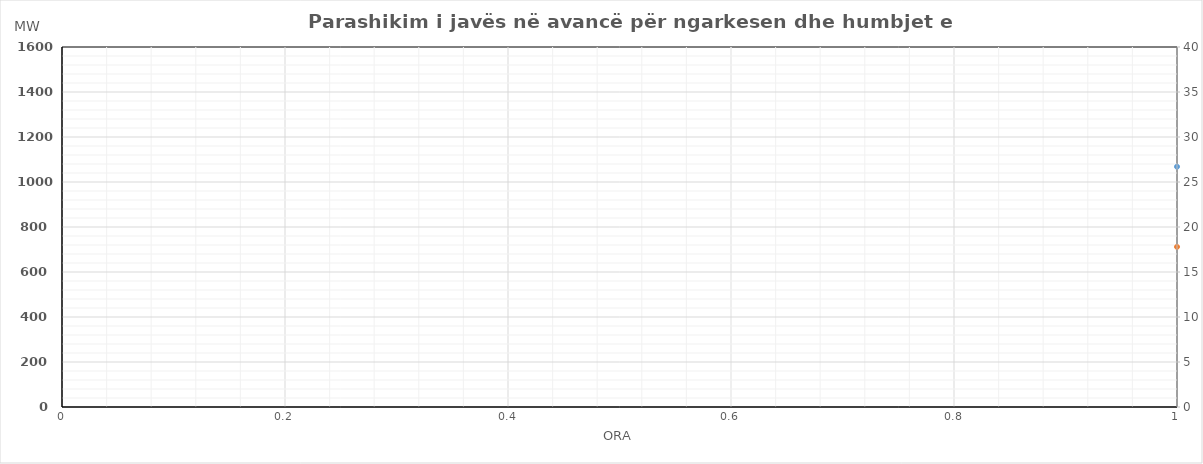
| Category | Ngarkesa (MWh) |
|---|---|
| 0 | 711.647 |
| 1 | 613.781 |
| 2 | 565.813 |
| 3 | 544.857 |
| 4 | 553.183 |
| 5 | 610.039 |
| 6 | 721.594 |
| 7 | 914.611 |
| 8 | 1063.562 |
| 9 | 1097.433 |
| 10 | 1072.949 |
| 11 | 1039.997 |
| 12 | 1034.129 |
| 13 | 1038.083 |
| 14 | 1034.867 |
| 15 | 1055.49 |
| 16 | 1142.966 |
| 17 | 1227.331 |
| 18 | 1224.467 |
| 19 | 1205.721 |
| 20 | 1165.87 |
| 21 | 1079.936 |
| 22 | 956.059 |
| 23 | 812.971 |
| 24 | 688.683 |
| 25 | 595.846 |
| 26 | 548.36 |
| 27 | 532.952 |
| 28 | 542.149 |
| 29 | 593.256 |
| 30 | 711.178 |
| 31 | 895.248 |
| 32 | 1051.552 |
| 33 | 1082.606 |
| 34 | 1047.328 |
| 35 | 1018.969 |
| 36 | 999.77 |
| 37 | 1002.435 |
| 38 | 1000.434 |
| 39 | 1027.436 |
| 40 | 1112.126 |
| 41 | 1214.141 |
| 42 | 1215.835 |
| 43 | 1204.718 |
| 44 | 1175.874 |
| 45 | 1093.389 |
| 46 | 956.792 |
| 47 | 802.391 |
| 48 | 662.209 |
| 49 | 578.369 |
| 50 | 541.719 |
| 51 | 528.528 |
| 52 | 539.391 |
| 53 | 597.205 |
| 54 | 736.454 |
| 55 | 945.028 |
| 56 | 1098.146 |
| 57 | 1129.258 |
| 58 | 1098.046 |
| 59 | 1075.029 |
| 60 | 1056.374 |
| 61 | 1061.212 |
| 62 | 1059.638 |
| 63 | 1072.526 |
| 64 | 1143.661 |
| 65 | 1244.459 |
| 66 | 1246.051 |
| 67 | 1232.528 |
| 68 | 1202.997 |
| 69 | 1115.603 |
| 70 | 970.593 |
| 71 | 820.252 |
| 72 | 677.515 |
| 73 | 587.584 |
| 74 | 564.581 |
| 75 | 577.625 |
| 76 | 600.636 |
| 77 | 602.118 |
| 78 | 748.11 |
| 79 | 979.157 |
| 80 | 1093.704 |
| 81 | 1136.701 |
| 82 | 1112.116 |
| 83 | 1097.788 |
| 84 | 1087.725 |
| 85 | 1090.627 |
| 86 | 1105.341 |
| 87 | 1107.034 |
| 88 | 1151.097 |
| 89 | 1253.878 |
| 90 | 1261.014 |
| 91 | 1240.899 |
| 92 | 1221.73 |
| 93 | 1130.661 |
| 94 | 987.096 |
| 95 | 830.471 |
| 96 | 680.381 |
| 97 | 596.766 |
| 98 | 554.712 |
| 99 | 542.548 |
| 100 | 552.847 |
| 101 | 610.561 |
| 102 | 747.347 |
| 103 | 963.656 |
| 104 | 1097.093 |
| 105 | 1122.187 |
| 106 | 1088.995 |
| 107 | 1066.463 |
| 108 | 1047.183 |
| 109 | 1049.792 |
| 110 | 1066.978 |
| 111 | 1080.406 |
| 112 | 1151.752 |
| 113 | 1242.822 |
| 114 | 1246.496 |
| 115 | 1236.878 |
| 116 | 1205.527 |
| 117 | 1124.126 |
| 118 | 977.201 |
| 119 | 814.824 |
| 120 | 718.107 |
| 121 | 624.396 |
| 122 | 576.082 |
| 123 | 558.806 |
| 124 | 569.661 |
| 125 | 623.585 |
| 126 | 755.458 |
| 127 | 976.662 |
| 128 | 1145.444 |
| 129 | 1174.988 |
| 130 | 1140.956 |
| 131 | 1113.51 |
| 132 | 1117.699 |
| 133 | 1121.925 |
| 134 | 1143.495 |
| 135 | 1173.403 |
| 136 | 1256.884 |
| 137 | 1368.392 |
| 138 | 1355.715 |
| 139 | 1307.761 |
| 140 | 1227.121 |
| 141 | 1119.277 |
| 142 | 1011.568 |
| 143 | 902.565 |
| 144 | 566.403 |
| 145 | 507.095 |
| 146 | 480.385 |
| 147 | 472.853 |
| 148 | 476.318 |
| 149 | 517.802 |
| 150 | 601.521 |
| 151 | 729.046 |
| 152 | 864.731 |
| 153 | 935.531 |
| 154 | 946.555 |
| 155 | 935.188 |
| 156 | 934.399 |
| 157 | 946.888 |
| 158 | 935.703 |
| 159 | 945.954 |
| 160 | 1024.245 |
| 161 | 1084.873 |
| 162 | 1072.441 |
| 163 | 1070.816 |
| 164 | 1056.265 |
| 165 | 971.025 |
| 166 | 830.002 |
| 167 | 683.018 |